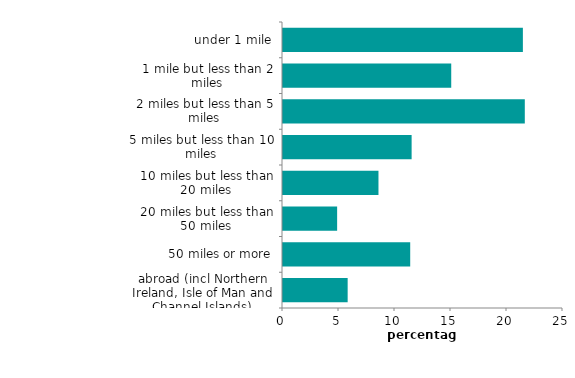
| Category | Series 0 |
|---|---|
| abroad (incl Northern Ireland, Isle of Man and Channel Islands) | 5.773 |
| 50 miles or more | 11.358 |
| 20 miles but less than 50 miles | 4.833 |
| 10 miles but less than 20 miles | 8.524 |
| 5 miles but less than 10 miles | 11.484 |
| 2 miles but less than 5 miles | 21.59 |
| 1 mile but less than 2 miles | 15.021 |
| under 1 mile | 21.418 |